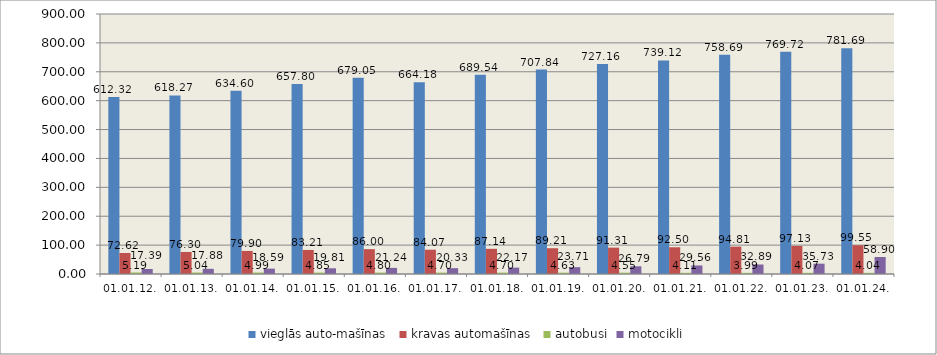
| Category | vieglās auto-mašīnas | kravas automašīnas | autobusi | motocikli |
|---|---|---|---|---|
| 01.01.12. | 612.321 | 72.622 | 5.186 | 17.385 |
| 01.01.13. | 618.274 | 76.303 | 5.044 | 17.879 |
| 01.01.14. | 634.603 | 79.899 | 4.989 | 18.587 |
| 01.01.15. | 657.799 | 83.205 | 4.845 | 19.807 |
| 01.01.16. | 679.048 | 85.998 | 4.797 | 21.241 |
| 01.01.17. | 664.177 | 84.067 | 4.696 | 20.329 |
| 01.01.18. | 689.536 | 87.143 | 4.701 | 22.166 |
| 01.01.19. | 707.841 | 89.211 | 4.632 | 23.713 |
| 01.01.20. | 727.164 | 91.311 | 4.549 | 26.785 |
| 01.01.21. | 739.124 | 92.499 | 4.105 | 29.561 |
| 01.01.22. | 758.688 | 94.811 | 3.992 | 32.893 |
| 01.01.23. | 769.723 | 97.128 | 4.068 | 35.732 |
| 01.01.24. | 781.69 | 99.549 | 4.041 | 58.9 |